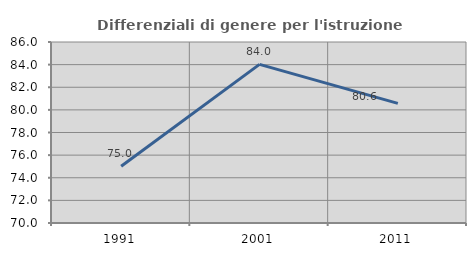
| Category | Differenziali di genere per l'istruzione superiore |
|---|---|
| 1991.0 | 75.024 |
| 2001.0 | 84.023 |
| 2011.0 | 80.57 |